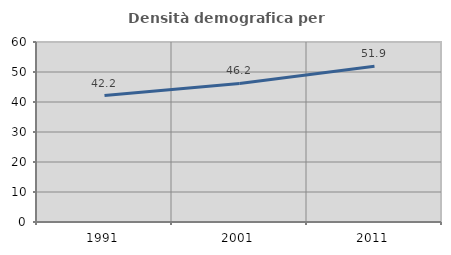
| Category | Densità demografica |
|---|---|
| 1991.0 | 42.163 |
| 2001.0 | 46.171 |
| 2011.0 | 51.942 |